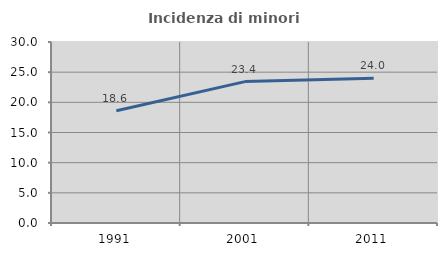
| Category | Incidenza di minori stranieri |
|---|---|
| 1991.0 | 18.605 |
| 2001.0 | 23.438 |
| 2011.0 | 23.995 |